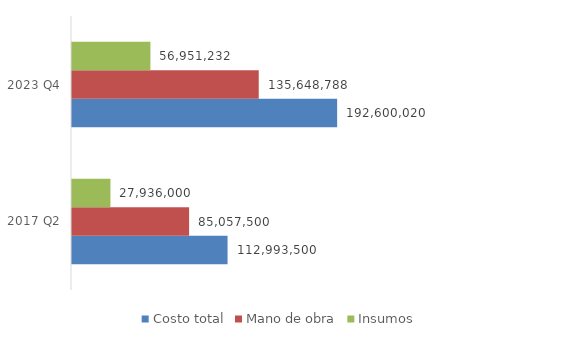
| Category | Costo total | Mano de obra | Insumos |
|---|---|---|---|
| 2017 Q2 | 112993500 | 85057500 | 27936000 |
| 2023 Q4 | 192600020.122 | 135648788 | 56951232.122 |